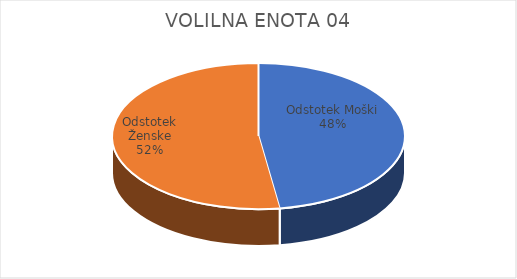
| Category | VOLILNA ENOTA 04 | #REF! | Slovenija skupaj |
|---|---|---|---|
| Odstotek Moški | 14.58 |  | 13.7 |
| Odstotek Ženske | 15.99 |  | 14.52 |